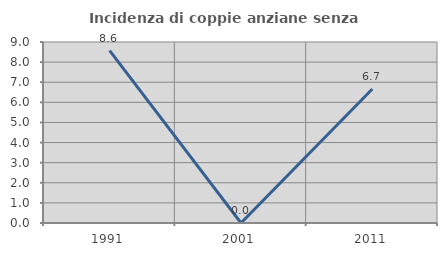
| Category | Incidenza di coppie anziane senza figli  |
|---|---|
| 1991.0 | 8.571 |
| 2001.0 | 0 |
| 2011.0 | 6.667 |